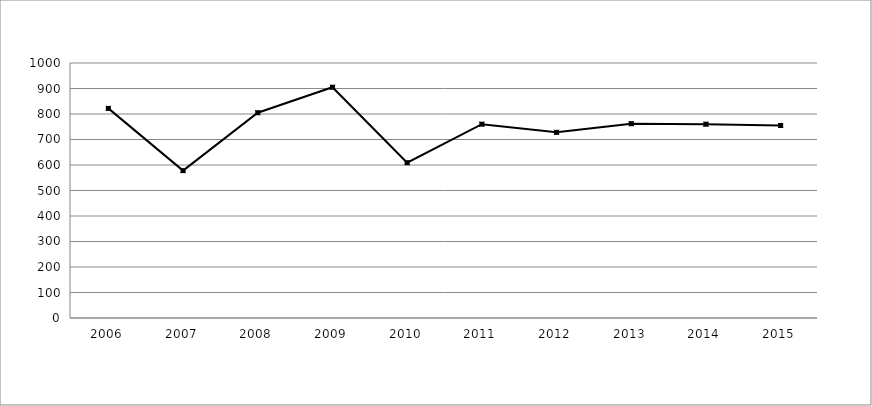
| Category | Series 1 |
|---|---|
| 2006.0 | 822 |
| 2007.0 | 578 |
| 2008.0 | 805 |
| 2009.0 | 905 |
| 2010.0 | 609 |
| 2011.0 | 760 |
| 2012.0 | 728 |
| 2013.0 | 762 |
| 2014.0 | 760 |
| 2015.0 | 755 |